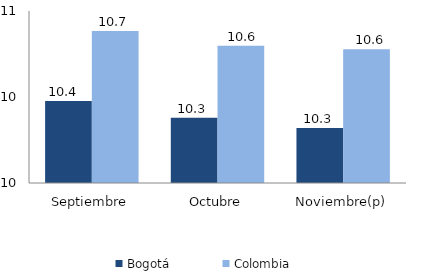
| Category | Bogotá | Colombia |
|---|---|---|
| Septiembre | 10.381 | 10.708 |
| Octubre | 10.304 | 10.639 |
| Noviembre(p) | 10.256 | 10.622 |